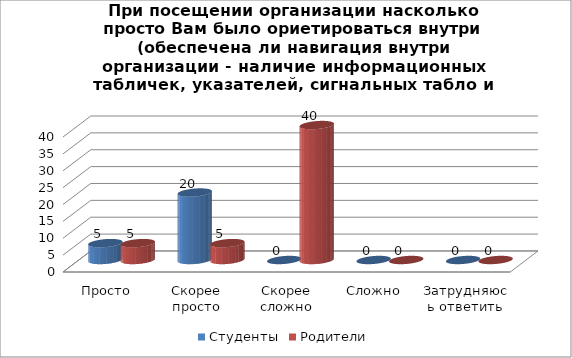
| Category | Студенты | Родители |
|---|---|---|
| Просто | 5 | 5 |
| Скорее просто | 20 | 5 |
| Скорее сложно | 0 | 40 |
| Сложно | 0 | 0 |
| Затрудняюсь ответить | 0 | 0 |